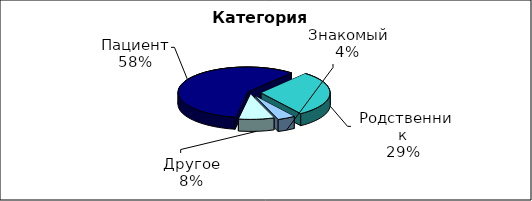
| Category | Series 0 |
|---|---|
| Пациент | 700 |
|  Родственник | 350 |
| Знакомый | 50 |
| Другое | 100 |